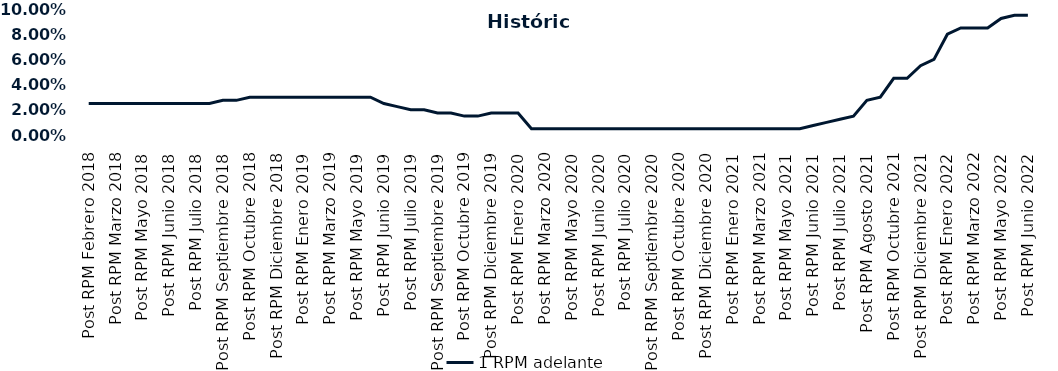
| Category | 1 RPM adelante |
|---|---|
| Post RPM Febrero 2018 | 0.025 |
| Pre RPM Marzo 2018 | 0.025 |
| Post RPM Marzo 2018 | 0.025 |
| Pre RPM Mayo 2018 | 0.025 |
| Post RPM Mayo 2018 | 0.025 |
| Pre RPM Junio 2018 | 0.025 |
| Post RPM Junio 2018 | 0.025 |
| Pre RPM Julio 2018 | 0.025 |
| Post RPM Julio 2018 | 0.025 |
| Pre RPM Septiembre 2018 | 0.025 |
| Post RPM Septiembre 2018 | 0.028 |
| Pre RPM Octubre 2018 | 0.028 |
| Post RPM Octubre 2018 | 0.03 |
| Pre RPM Diciembre 2018 | 0.03 |
| Post RPM Diciembre 2018 | 0.03 |
| Pre RPM Enero 2019 | 0.03 |
| Post RPM Enero 2019 | 0.03 |
| Pre RPM Marzo 2019 | 0.03 |
| Post RPM Marzo 2019 | 0.03 |
| Pre RPM Mayo 2019 | 0.03 |
| Post RPM Mayo 2019 | 0.03 |
| Pre RPM Junio 2019 | 0.03 |
| Post RPM Junio 2019 | 0.025 |
| Pre RPM Julio 2019 | 0.022 |
| Post RPM Julio 2019 | 0.02 |
| Pre RPM Septiembre 2019 | 0.02 |
| Post RPM Septiembre 2019 | 0.018 |
| Pre RPM Octubre 2019 | 0.018 |
| Post RPM Octubre 2019 | 0.015 |
| Pre RPM Diciembre 2019 | 0.015 |
| Post RPM Diciembre 2019 | 0.018 |
| Pre RPM Enero 2020 | 0.018 |
| Post RPM Enero 2020 | 0.018 |
| Pre RPM Marzo 2020 | 0.005 |
| Post RPM Marzo 2020 | 0.005 |
| Pre RPM Mayo 2020 | 0.005 |
| Post RPM Mayo 2020 | 0.005 |
| Pre RPM Junio 2020 | 0.005 |
| Post RPM Junio 2020 | 0.005 |
| Pre RPM Julio 2020 | 0.005 |
| Post RPM Julio 2020 | 0.005 |
| Pre RPM Septiembre 2020 | 0.005 |
| Post RPM Septiembre 2020 | 0.005 |
| Pre RPM Octubre 2020 | 0.005 |
| Post RPM Octubre 2020 | 0.005 |
| Pre RPM Diciembre 2020 | 0.005 |
| Post RPM Diciembre 2020 | 0.005 |
| Pre RPM Enero 2021 | 0.005 |
| Post RPM Enero 2021 | 0.005 |
| Pre RPM Marzo 2021 | 0.005 |
| Post RPM Marzo 2021 | 0.005 |
| Pre RPM Mayo 2021 | 0.005 |
| Post RPM Mayo 2021 | 0.005 |
| Pre RPM Junio 2021 | 0.005 |
| Post RPM Junio 2021 | 0.008 |
| Pre RPM Julio 2021 | 0.01 |
| Post RPM Julio 2021 | 0.012 |
| Pre RPM Agosto 2021 | 0.015 |
| Post RPM Agosto 2021 | 0.028 |
| Pre RPM Octubre 2021 | 0.03 |
| Post RPM Octubre 2021 | 0.045 |
| Pre RPM Diciembre 2021 | 0.045 |
| Post RPM Diciembre 2021 | 0.055 |
| Pre RPM Enero 2022 | 0.06 |
| Post RPM Enero 2022 | 0.08 |
| Pre RPM Marzo 2022 | 0.085 |
| Post RPM Marzo 2022 | 0.085 |
| Pre RPM Mayo 2022 | 0.085 |
| Post RPM Mayo 2022 | 0.092 |
| Pre RPM Junio 2022 | 0.095 |
| Post RPM Junio 2022 | 0.095 |